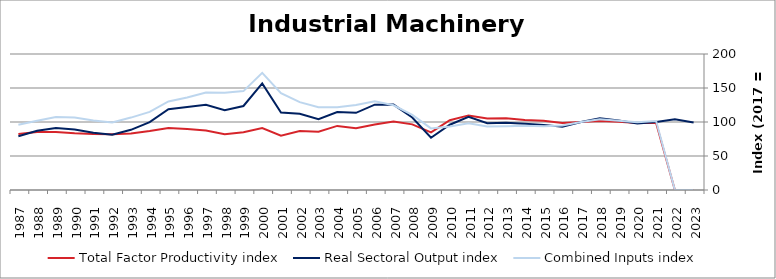
| Category | Total Factor Productivity index | Real Sectoral Output index | Combined Inputs index |
|---|---|---|---|
| 2023.0 | 0 | 99.121 | 0 |
| 2022.0 | 0 | 103.975 | 0 |
| 2021.0 | 98.559 | 100.057 | 101.52 |
| 2020.0 | 98.468 | 97.955 | 99.479 |
| 2019.0 | 100.516 | 102.292 | 101.767 |
| 2018.0 | 101.37 | 105.536 | 104.11 |
| 2017.0 | 100 | 100 | 100 |
| 2016.0 | 98.393 | 93.201 | 94.722 |
| 2015.0 | 101.972 | 95.774 | 93.921 |
| 2014.0 | 102.818 | 97.283 | 94.617 |
| 2013.0 | 105.598 | 98.929 | 93.684 |
| 2012.0 | 105.297 | 98.162 | 93.224 |
| 2011.0 | 109.712 | 107.479 | 97.965 |
| 2010.0 | 102.611 | 95.955 | 93.513 |
| 2009.0 | 84.817 | 76.864 | 90.623 |
| 2008.0 | 96.536 | 106.653 | 110.48 |
| 2007.0 | 100.746 | 125.576 | 124.647 |
| 2006.0 | 96.181 | 125.523 | 130.508 |
| 2005.0 | 90.819 | 113.519 | 124.994 |
| 2004.0 | 94.261 | 114.681 | 121.664 |
| 2003.0 | 85.618 | 104.23 | 121.738 |
| 2002.0 | 86.755 | 112.139 | 129.259 |
| 2001.0 | 79.835 | 113.795 | 142.538 |
| 2000.0 | 91.031 | 156.77 | 172.216 |
| 1999.0 | 84.944 | 123.545 | 145.442 |
| 1998.0 | 82.122 | 117.486 | 143.063 |
| 1997.0 | 87.465 | 125.41 | 143.383 |
| 1996.0 | 89.816 | 122.12 | 135.966 |
| 1995.0 | 91.25 | 118.853 | 130.251 |
| 1994.0 | 86.85 | 99.831 | 114.946 |
| 1993.0 | 83.129 | 88.527 | 106.493 |
| 1992.0 | 81.841 | 81.367 | 99.422 |
| 1991.0 | 82.19 | 84.077 | 102.297 |
| 1990.0 | 83.321 | 88.818 | 106.598 |
| 1989.0 | 85.124 | 91.312 | 107.27 |
| 1988.0 | 85.412 | 87.02 | 101.882 |
| 1987.0 | 82.478 | 79.132 | 95.944 |